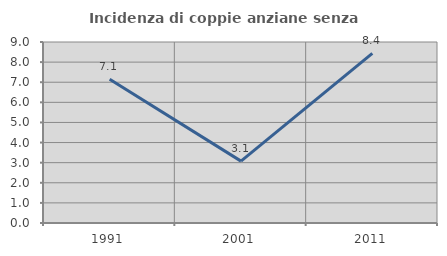
| Category | Incidenza di coppie anziane senza figli  |
|---|---|
| 1991.0 | 7.143 |
| 2001.0 | 3.077 |
| 2011.0 | 8.434 |